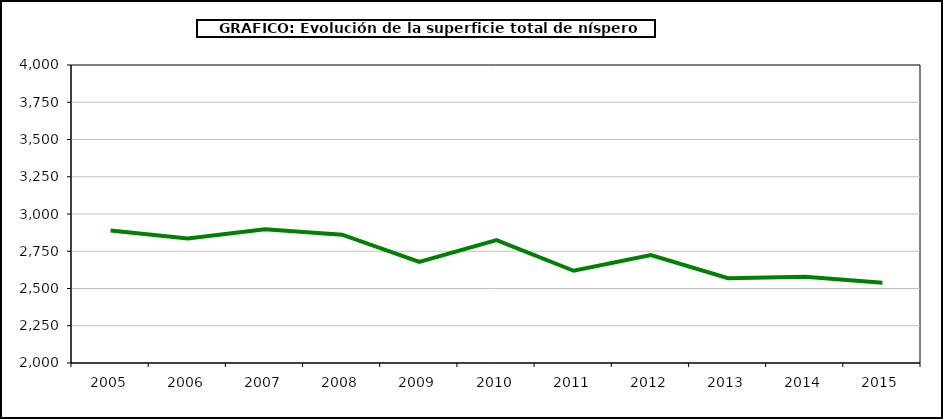
| Category | superficie níspero |
|---|---|
| 2005.0 | 2889 |
| 2006.0 | 2836 |
| 2007.0 | 2897 |
| 2008.0 | 2861 |
| 2009.0 | 2679 |
| 2010.0 | 2825 |
| 2011.0 | 2619 |
| 2012.0 | 2724 |
| 2013.0 | 2569 |
| 2014.0 | 2579 |
| 2015.0 | 2539 |